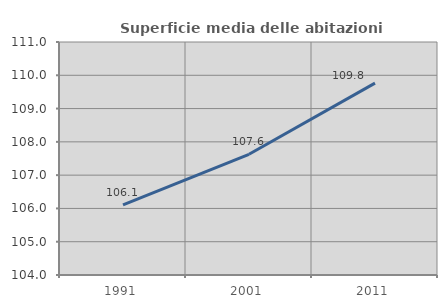
| Category | Superficie media delle abitazioni occupate |
|---|---|
| 1991.0 | 106.107 |
| 2001.0 | 107.627 |
| 2011.0 | 109.764 |